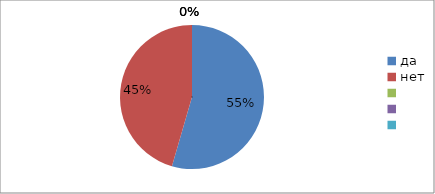
| Category | Series 0 | Series 1 |
|---|---|---|
| да | 54.5 | 54.5 |
| нет | 45.5 | 45.5 |